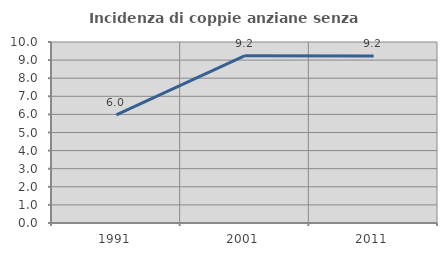
| Category | Incidenza di coppie anziane senza figli  |
|---|---|
| 1991.0 | 5.97 |
| 2001.0 | 9.244 |
| 2011.0 | 9.232 |